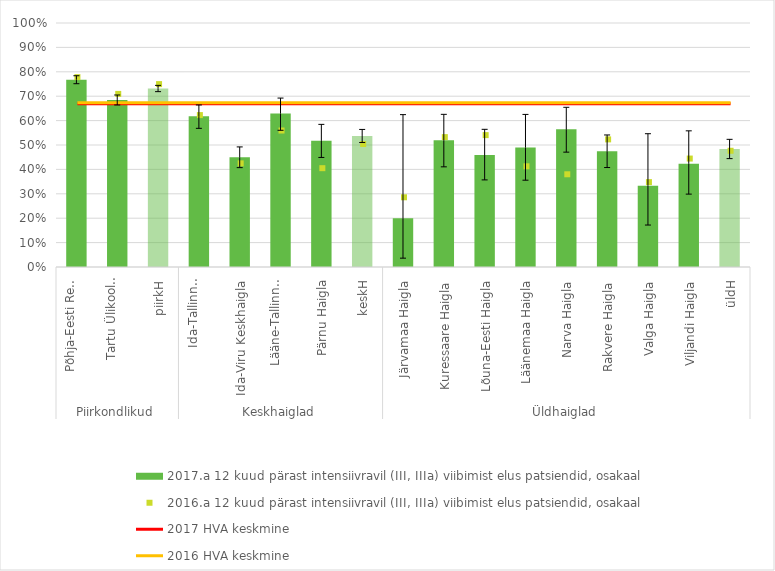
| Category | 2017.a 12 kuud pärast intensiivravil (III, IIIa) viibimist elus patsiendid, osakaal |
|---|---|
| 0 | 0.768 |
| 1 | 0.685 |
| 2 | 0.732 |
| 3 | 0.617 |
| 4 | 0.449 |
| 5 | 0.629 |
| 6 | 0.517 |
| 7 | 0.537 |
| 8 | 0.2 |
| 9 | 0.519 |
| 10 | 0.459 |
| 11 | 0.49 |
| 12 | 0.565 |
| 13 | 0.474 |
| 14 | 0.333 |
| 15 | 0.423 |
| 16 | 0.484 |